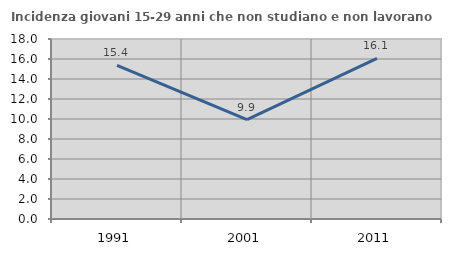
| Category | Incidenza giovani 15-29 anni che non studiano e non lavorano  |
|---|---|
| 1991.0 | 15.365 |
| 2001.0 | 9.932 |
| 2011.0 | 16.054 |